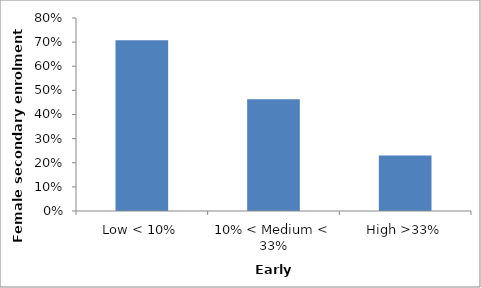
| Category | Female secondary enrolment rate |
|---|---|
| Low < 10% | 0.708 |
| 10% < Medium < 33% | 0.463 |
| High >33% | 0.23 |